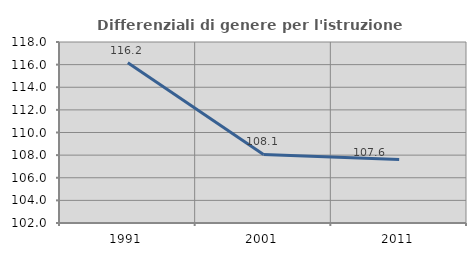
| Category | Differenziali di genere per l'istruzione superiore |
|---|---|
| 1991.0 | 116.159 |
| 2001.0 | 108.056 |
| 2011.0 | 107.604 |